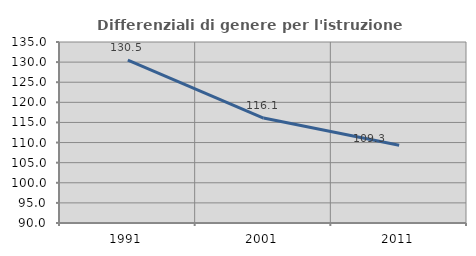
| Category | Differenziali di genere per l'istruzione superiore |
|---|---|
| 1991.0 | 130.486 |
| 2001.0 | 116.083 |
| 2011.0 | 109.324 |